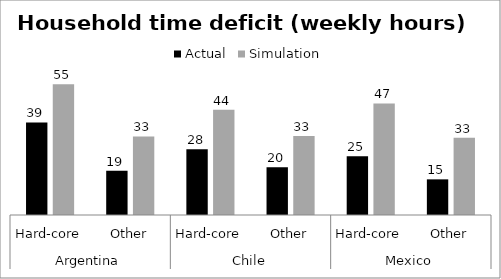
| Category | Actual | Simulation |
|---|---|---|
| 0 | 39.124 | 55.251 |
| 1 | 18.692 | 33.201 |
| 2 | 27.753 | 44.472 |
| 3 | 20.155 | 33.375 |
| 4 | 24.858 | 47.115 |
| 5 | 15.063 | 32.67 |